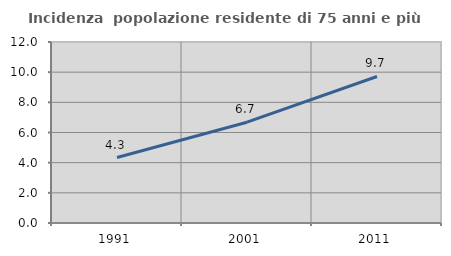
| Category | Incidenza  popolazione residente di 75 anni e più |
|---|---|
| 1991.0 | 4.339 |
| 2001.0 | 6.683 |
| 2011.0 | 9.715 |